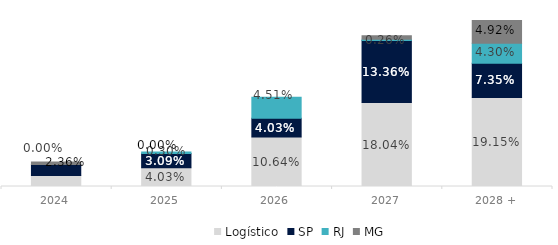
| Category | Logístico | SP | RJ | MG |
|---|---|---|---|---|
| 2024 | 0.024 | 0.024 | 0 | 0.006 |
| 2025 | 0.04 | 0.031 | 0.003 | 0 |
| 2026 | 0.106 | 0.04 | 0.045 | 0 |
| 2027 | 0.18 | 0.134 | 0.003 | 0.007 |
| 2028 + | 0.191 | 0.074 | 0.043 | 0.049 |